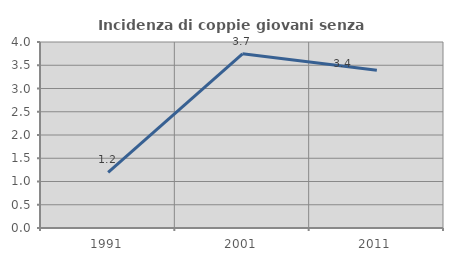
| Category | Incidenza di coppie giovani senza figli |
|---|---|
| 1991.0 | 1.194 |
| 2001.0 | 3.746 |
| 2011.0 | 3.394 |